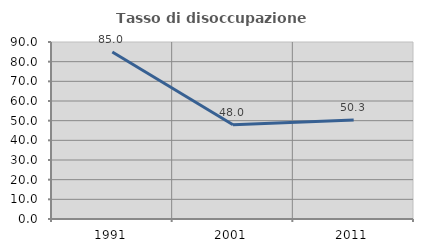
| Category | Tasso di disoccupazione giovanile  |
|---|---|
| 1991.0 | 84.956 |
| 2001.0 | 47.959 |
| 2011.0 | 50.303 |